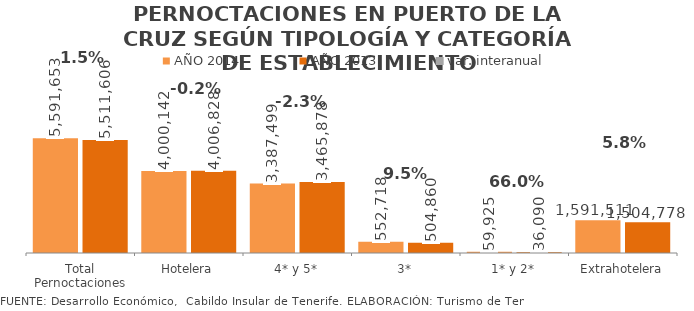
| Category | AÑO 2014 | AÑO 2013 |
|---|---|---|
| Total Pernoctaciones | 5591653 | 5511606 |
| Hotelera | 4000142 | 4006828 |
| 4* y 5* | 3387499 | 3465878 |
| 3* | 552718 | 504860 |
| 1* y 2* | 59925 | 36090 |
| Extrahotelera | 1591511 | 1504778 |